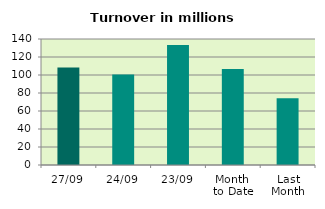
| Category | Series 0 |
|---|---|
| 27/09 | 108.271 |
| 24/09 | 100.55 |
| 23/09 | 133.323 |
| Month 
to Date | 106.804 |
| Last
Month | 74.221 |